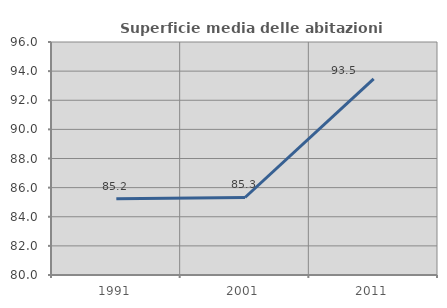
| Category | Superficie media delle abitazioni occupate |
|---|---|
| 1991.0 | 85.235 |
| 2001.0 | 85.323 |
| 2011.0 | 93.467 |